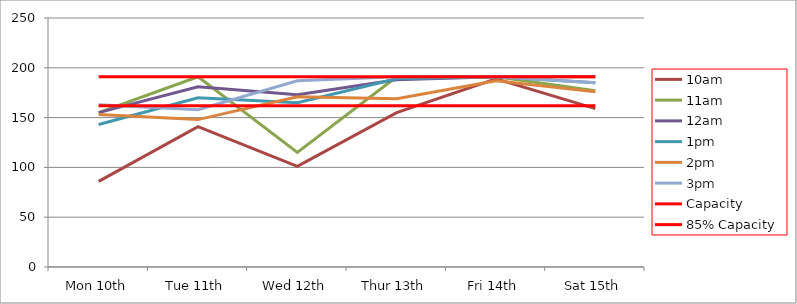
| Category | 9am | 10am | 11am | 12am | 1pm | 2pm | 3pm | 4pm | 5pm | Capacity | 85% Capacity |
|---|---|---|---|---|---|---|---|---|---|---|---|
| Mon 10th |  | 86 | 155 | 155 | 143 | 153 | 163 |  |  | 191 | 162 |
| Tue 11th |  | 141 | 191 | 181 | 170 | 148 | 158 |  |  | 191 | 162 |
| Wed 12th |  | 101 | 115 | 173 | 165 | 171 | 187 |  |  | 191 | 162 |
| Thur 13th |  | 155 | 191 | 188 | 189 | 169 | 191 |  |  | 191 | 162 |
| Fri 14th |  | 189 | 191 | 191 | 191 | 187 | 191 |  |  | 191 | 162 |
| Sat 15th |  | 159 | 177 | 191 | 185 | 176 | 185 |  |  | 191 | 162 |